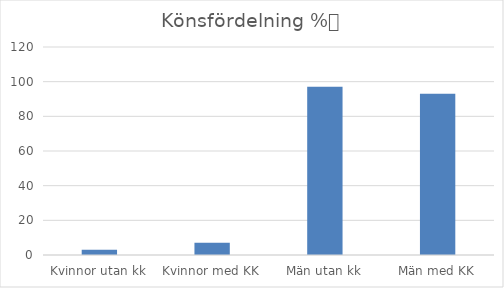
| Category | Andel |
|---|---|
| Kvinnor utan kk | 3 |
| Kvinnor med KK | 7 |
| Män utan kk | 97 |
| Män med KK | 93 |